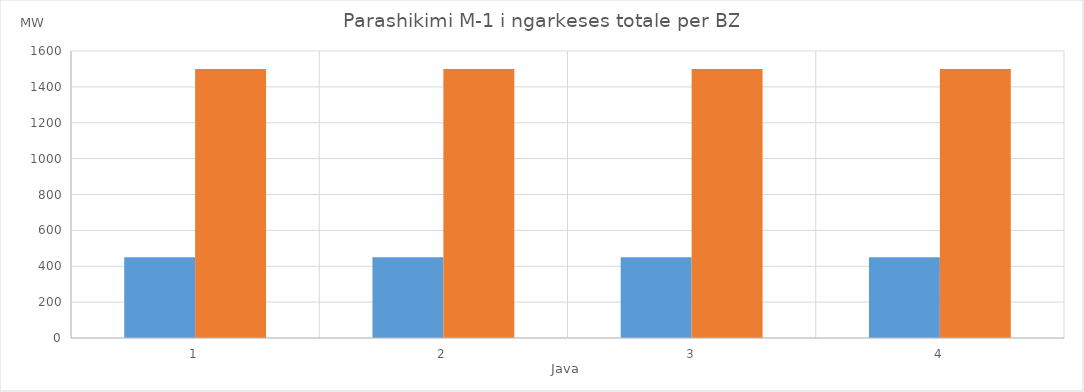
| Category | Min (MW) | Max (MW) |
|---|---|---|
| 0 | 450 | 1500 |
| 1 | 450 | 1500 |
| 2 | 450 | 1500 |
| 3 | 450 | 1500 |